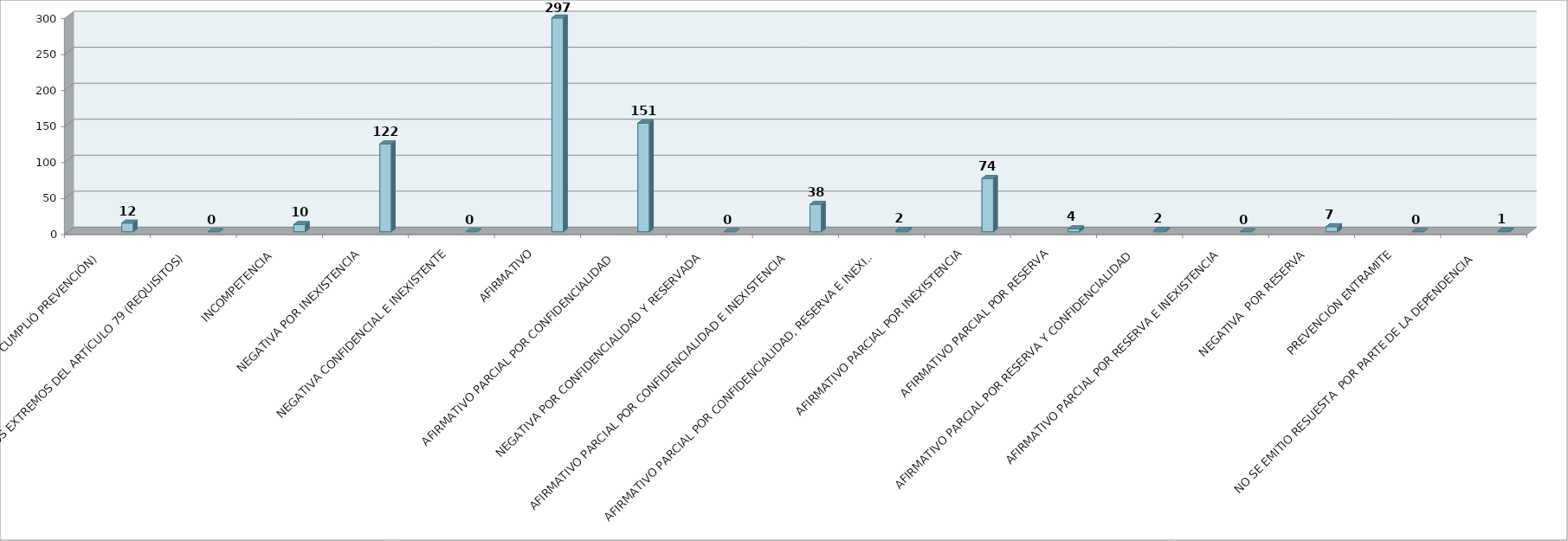
| Category | Series 0 | Series 1 | Series 2 | Series 3 | Series 4 | Series 5 |
|---|---|---|---|---|---|---|
| SE TIENE POR NO PRESENTADA ( NO CUMPLIÓ PREVENCIÓN) |  |  |  |  | 12 |  |
| NO CUMPLIO CON LOS EXTREMOS DEL ARTÍCULO 79 (REQUISITOS) |  |  |  |  | 0 |  |
| INCOMPETENCIA  |  |  |  |  | 10 |  |
| NEGATIVA POR INEXISTENCIA |  |  |  |  | 122 |  |
| NEGATIVA CONFIDENCIAL E INEXISTENTE |  |  |  |  | 0 |  |
| AFIRMATIVO |  |  |  |  | 297 |  |
| AFIRMATIVO PARCIAL POR CONFIDENCIALIDAD  |  |  |  |  | 151 |  |
| NEGATIVA POR CONFIDENCIALIDAD Y RESERVADA |  |  |  |  | 0 |  |
| AFIRMATIVO PARCIAL POR CONFIDENCIALIDAD E INEXISTENCIA |  |  |  |  | 38 |  |
| AFIRMATIVO PARCIAL POR CONFIDENCIALIDAD, RESERVA E INEXISTENCIA |  |  |  |  | 2 |  |
| AFIRMATIVO PARCIAL POR INEXISTENCIA |  |  |  |  | 74 |  |
| AFIRMATIVO PARCIAL POR RESERVA |  |  |  |  | 4 |  |
| AFIRMATIVO PARCIAL POR RESERVA Y CONFIDENCIALIDAD |  |  |  |  | 2 |  |
| AFIRMATIVO PARCIAL POR RESERVA E INEXISTENCIA |  |  |  |  | 0 |  |
| NEGATIVA  POR RESERVA |  |  |  |  | 7 |  |
| PREVENCIÓN ENTRAMITE |  |  |  |  | 0 |  |
| NO SE EMITIO RESUESTA  POR PARTE DE LA DEPENDENCIA |  |  |  |  | 1 |  |